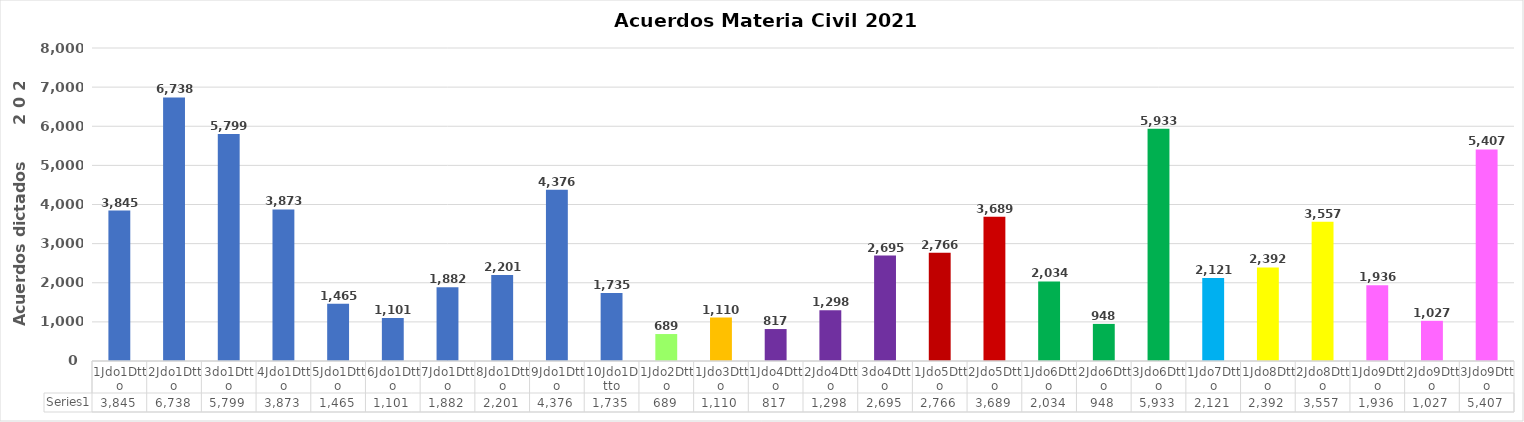
| Category | Series 0 |
|---|---|
| 1Jdo1Dtto | 3845 |
| 2Jdo1Dtto | 6738 |
| 3do1Dtto | 5799 |
| 4Jdo1Dtto | 3873 |
| 5Jdo1Dtto | 1465 |
| 6Jdo1Dtto | 1101 |
| 7Jdo1Dtto | 1882 |
| 8Jdo1Dtto | 2201 |
| 9Jdo1Dtto | 4376 |
| 10Jdo1Dtto | 1735 |
| 1Jdo2Dtto | 689 |
| 1Jdo3Dtto | 1110 |
| 1Jdo4Dtto | 817 |
| 2Jdo4Dtto | 1298 |
| 3do4Dtto | 2695 |
| 1Jdo5Dtto | 2766 |
| 2Jdo5Dtto | 3689 |
| 1Jdo6Dtto | 2034 |
| 2Jdo6Dtto | 948 |
| 3Jdo6Dtto | 5933 |
| 1Jdo7Dtto | 2121 |
| 1Jdo8Dtto | 2392 |
| 2Jdo8Dtto | 3557 |
| 1Jdo9Dtto | 1936 |
| 2Jdo9Dtto | 1027 |
| 3Jdo9Dtto | 5407 |